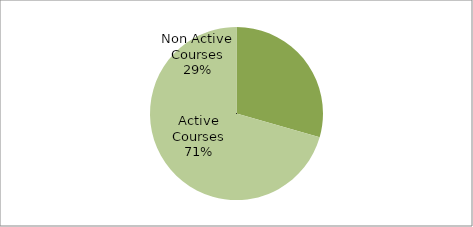
| Category | Series 0 |
|---|---|
| Non Active Courses | 209 |
| Active Courses | 501 |